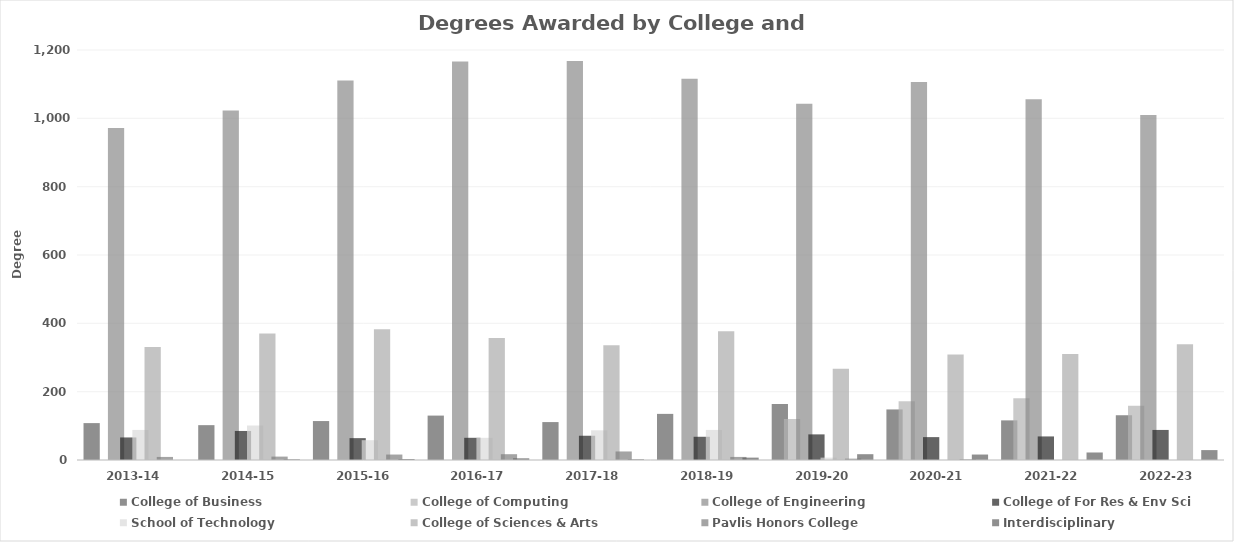
| Category | College of Business | College of Computing | College of Engineering | College of For Res & Env Sci | School of Technology | College of Sciences & Arts | Pavlis Honors College | Interdisciplinary |
|---|---|---|---|---|---|---|---|---|
| 2013-14  | 108 | 0 | 972 | 66 | 88 | 331 | 9 | 0 |
| 2014-15  | 102 | 0 | 1023 | 85 | 101 | 370 | 10 | 2 |
| 2015-16  | 114 | 0 | 1111 | 64 | 58 | 383 | 16 | 3 |
| 2016-17  | 130 | 0 | 1166 | 65 | 65 | 357 | 17 | 5 |
| 2017-18  | 111 | 0 | 1168 | 71 | 87 | 336 | 25 | 2 |
| 2018-19  | 135 | 0 | 1116 | 68 | 88 | 377 | 9 | 7 |
| 2019-20  | 164 | 120 | 1043 | 75 | 7 | 267 | 4 | 17 |
| 2020-21  | 148 | 172 | 1106 | 67 | 0 | 309 | 2 | 16 |
| 2021-22  | 116 | 181 | 1056 | 69 | 0 | 310 | 0 | 22 |
| 2022-23  | 131 | 159 | 1010 | 88 | 0 | 339 | 0 | 29 |